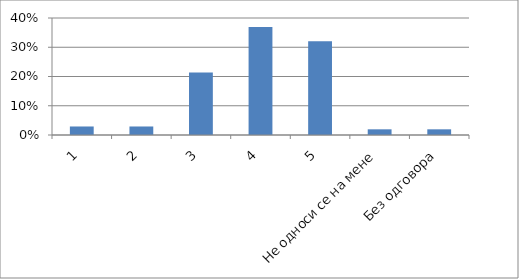
| Category | Series 0 |
|---|---|
| 1 | 0.029 |
| 2 | 0.029 |
| 3 | 0.214 |
| 4 | 0.369 |
| 5 | 0.32 |
| Не односи се на мене | 0.019 |
| Без одговора | 0.019 |